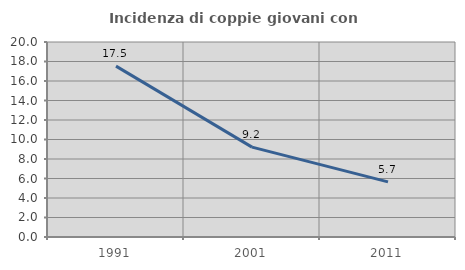
| Category | Incidenza di coppie giovani con figli |
|---|---|
| 1991.0 | 17.526 |
| 2001.0 | 9.219 |
| 2011.0 | 5.658 |